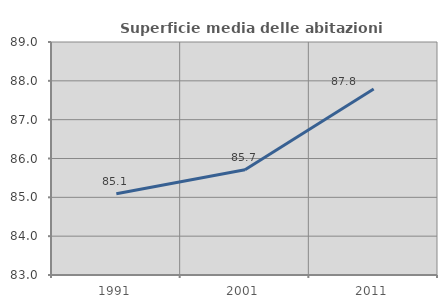
| Category | Superficie media delle abitazioni occupate |
|---|---|
| 1991.0 | 85.093 |
| 2001.0 | 85.712 |
| 2011.0 | 87.787 |